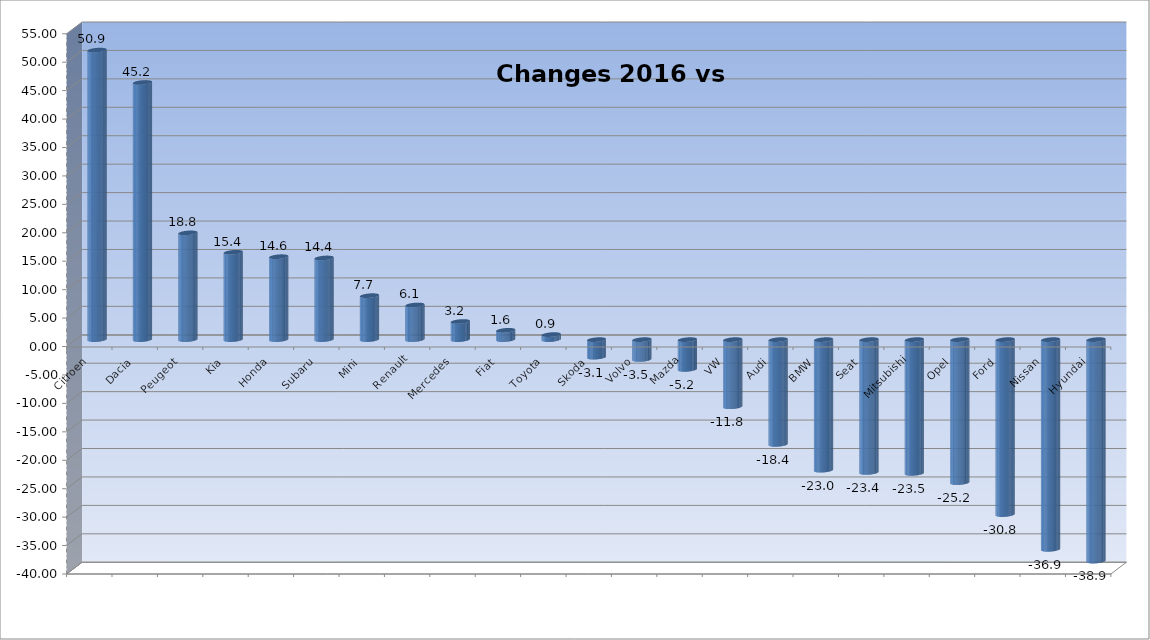
| Category | Ytd 2015 |
|---|---|
| Citroen | 50.915 |
| Dacia | 45.22 |
| Peugeot | 18.773 |
| Kia | 15.361 |
| Honda | 14.583 |
| Subaru | 14.363 |
| Mini | 7.732 |
| Renault | 6.092 |
| Mercedes | 3.186 |
| Fiat | 1.639 |
| Toyota | 0.886 |
| Skoda | -3.087 |
| Volvo | -3.495 |
| Mazda | -5.239 |
| VW | -11.802 |
| Audi | -18.428 |
| BMW | -22.96 |
| Seat | -23.361 |
| Mitsubishi | -23.529 |
| Opel | -25.152 |
| Ford | -30.769 |
| Nissan | -36.883 |
| Hyundai | -38.947 |